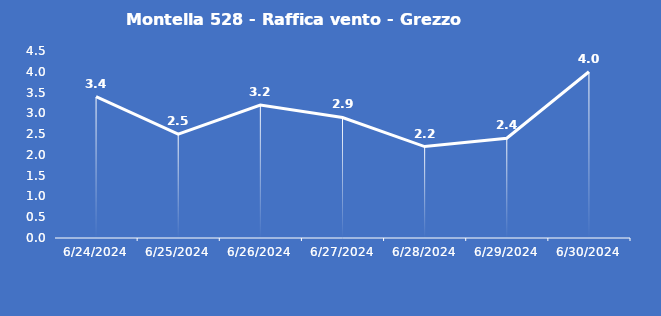
| Category | Montella 528 - Raffica vento - Grezzo (m/s) |
|---|---|
| 6/24/24 | 3.4 |
| 6/25/24 | 2.5 |
| 6/26/24 | 3.2 |
| 6/27/24 | 2.9 |
| 6/28/24 | 2.2 |
| 6/29/24 | 2.4 |
| 6/30/24 | 4 |